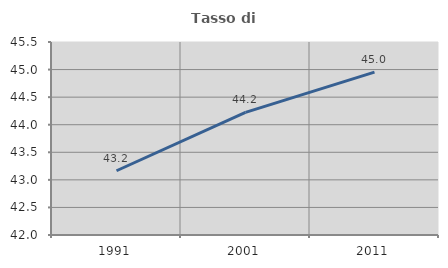
| Category | Tasso di occupazione   |
|---|---|
| 1991.0 | 43.165 |
| 2001.0 | 44.225 |
| 2011.0 | 44.954 |